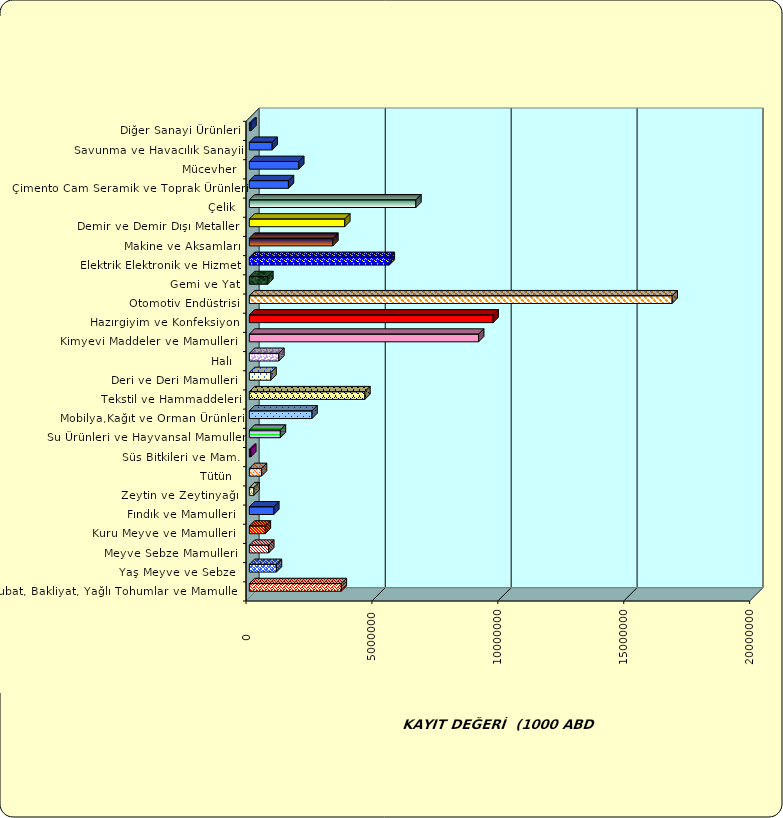
| Category | Series 0 |
|---|---|
|  Hububat, Bakliyat, Yağlı Tohumlar ve Mamulleri  | 3651223.52 |
|  Yaş Meyve ve Sebze   | 1075320.002 |
|  Meyve Sebze Mamulleri  | 769129.685 |
|  Kuru Meyve ve Mamulleri   | 634122.69 |
|  Fındık ve Mamulleri  | 971149.277 |
|  Zeytin ve Zeytinyağı  | 182824.079 |
|  Tütün  | 481466.362 |
|  Süs Bitkileri ve Mam. | 54369.667 |
|  Su Ürünleri ve Hayvansal Mamuller | 1231905.683 |
|  Mobilya,Kağıt ve Orman Ürünleri | 2487904.173 |
|  Tekstil ve Hammaddeleri | 4587099.74 |
|  Deri ve Deri Mamulleri  | 858387.34 |
|  Halı  | 1170831.455 |
|  Kimyevi Maddeler ve Mamulleri   | 9104995.324 |
|  Hazırgiyim ve Konfeksiyon  | 9680125.393 |
|  Otomotiv Endüstrisi | 16789438.008 |
|  Gemi ve Yat | 733798.473 |
|  Elektrik Elektronik ve Hizmet | 5557536.394 |
|  Makine ve Aksamları | 3315676.803 |
|  Demir ve Demir Dışı Metaller  | 3789163.193 |
|  Çelik | 6613275.21 |
|  Çimento Cam Seramik ve Toprak Ürünleri | 1553116.166 |
|  Mücevher | 1961013.561 |
|  Savunma ve Havacılık Sanayii | 907364.115 |
|  Diğer Sanayi Ürünleri | 63926.615 |